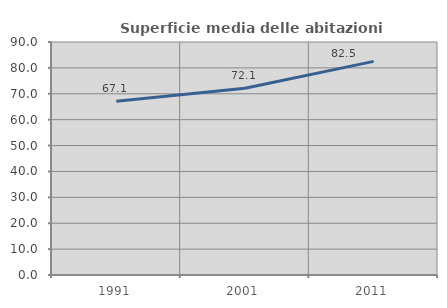
| Category | Superficie media delle abitazioni occupate |
|---|---|
| 1991.0 | 67.127 |
| 2001.0 | 72.124 |
| 2011.0 | 82.509 |